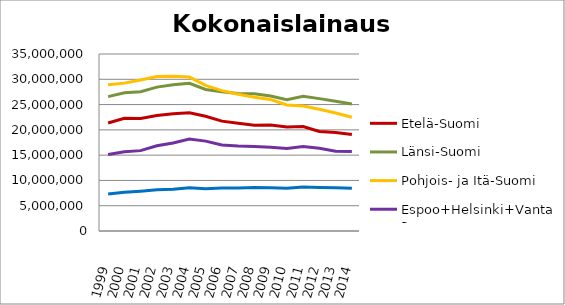
| Category | Etelä-Suomi | Länsi-Suomi | Pohjois- ja Itä-Suomi | Espoo+Helsinki+Vantaa | Muu Uusimaa |
|---|---|---|---|---|---|
| 1999.0 | 21366520 | 26571597 | 28904988 | 15127284 | 7294992 |
| 2000.0 | 22290303 | 27345815 | 29239828 | 15679381 | 7641868 |
| 2001.0 | 22267860 | 27551154 | 29867378 | 15893341 | 7881324 |
| 2002.0 | 22834770 | 28452053 | 30566257 | 16852672 | 8161743 |
| 2003.0 | 23204726 | 28918167 | 30614419 | 17400801 | 8267606 |
| 2004.0 | 23370513 | 29199046 | 30437897 | 18174668 | 8571388 |
| 2005.0 | 22677604 | 27997120 | 28780203 | 17772044 | 8342733 |
| 2006.0 | 21724244 | 27536789 | 27753580 | 17018463 | 8522381 |
| 2007.0 | 21316254 | 27187668 | 27051488 | 16799995 | 8484381 |
| 2008.0 | 20909889 | 27149793 | 26429669 | 16698655 | 8589188 |
| 2009.0 | 20967927 | 26692333 | 26001091 | 16578177 | 8545952 |
| 2010.0 | 20570723 | 25959656 | 24934449 | 16332058 | 8431139 |
| 2011.0 | 20664052 | 26638645 | 24732411 | 16716782 | 8675821 |
| 2012.0 | 19671495 | 26175528 | 24081862 | 16368998 | 8610465 |
| 2013.0 | 19457849 | 25648722 | 23333398 | 15768635 | 8567116 |
| 2014.0 | 19078612 | 25127778 | 22479540 | 15733133 | 8451045 |